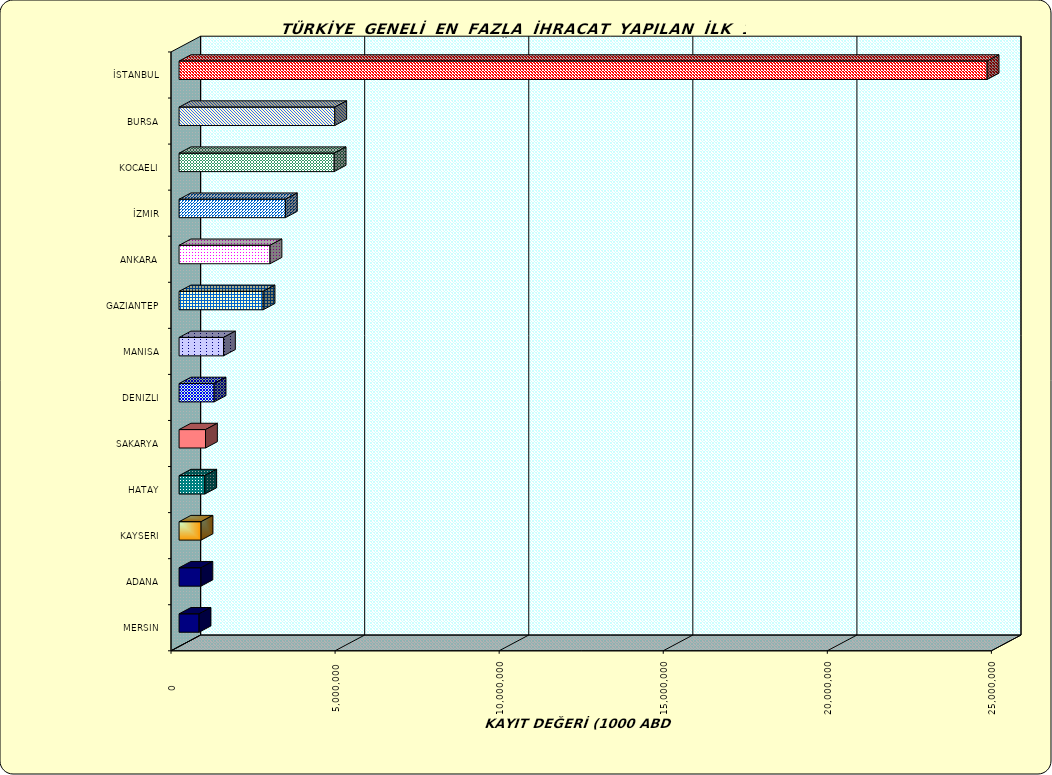
| Category | Series 0 |
|---|---|
| İSTANBUL | 24624231.628 |
| BURSA | 4744954.665 |
| KOCAELI | 4726361.858 |
| İZMIR | 3240349.082 |
| ANKARA | 2770741.328 |
| GAZIANTEP | 2560698.622 |
| MANISA | 1353780.942 |
| DENIZLI | 1067864.762 |
| SAKARYA | 805907.315 |
| HATAY | 783511.928 |
| KAYSERI | 669972.074 |
| ADANA | 666459.904 |
| MERSIN | 609004.367 |